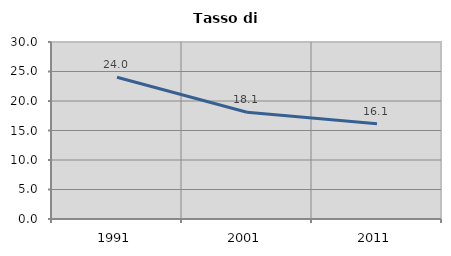
| Category | Tasso di disoccupazione   |
|---|---|
| 1991.0 | 24.029 |
| 2001.0 | 18.089 |
| 2011.0 | 16.134 |